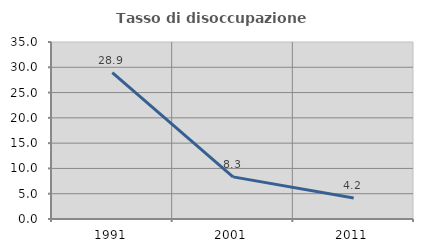
| Category | Tasso di disoccupazione giovanile  |
|---|---|
| 1991.0 | 28.947 |
| 2001.0 | 8.333 |
| 2011.0 | 4.167 |